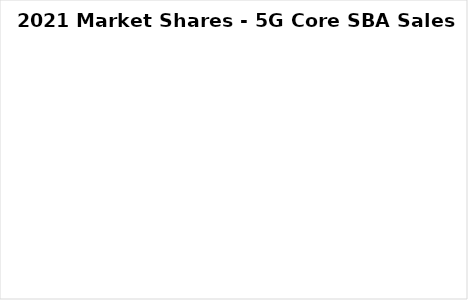
| Category | % |
|---|---|
| Cisco | 0 |
| Ericsson | 0 |
| Huawei | 0 |
| NEC | 0 |
| Nokia | 0 |
| Samsung | 0 |
| ZTE | 0 |
| Other | 0 |